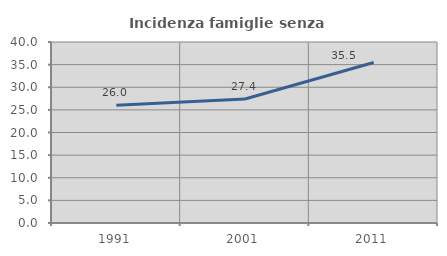
| Category | Incidenza famiglie senza nuclei |
|---|---|
| 1991.0 | 26.006 |
| 2001.0 | 27.415 |
| 2011.0 | 35.47 |